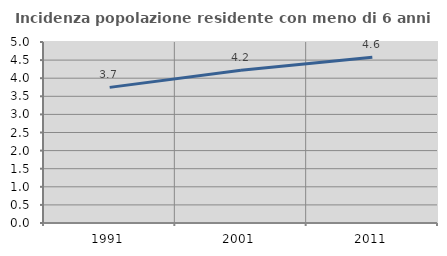
| Category | Incidenza popolazione residente con meno di 6 anni |
|---|---|
| 1991.0 | 3.746 |
| 2001.0 | 4.217 |
| 2011.0 | 4.578 |